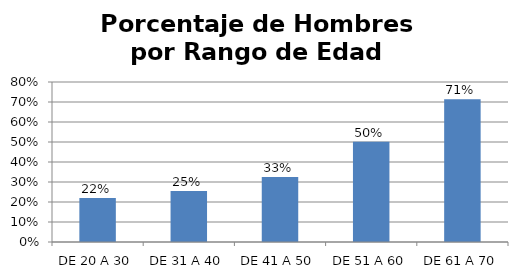
| Category | Porcentaje |
|---|---|
| DE 20 A 30 | 0.22 |
| DE 31 A 40 | 0.254 |
| DE 41 A 50 | 0.325 |
| DE 51 A 60 | 0.501 |
| DE 61 A 70 | 0.713 |